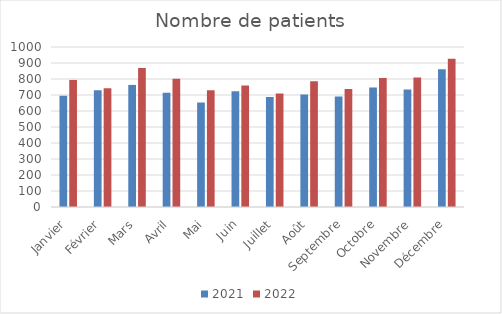
| Category | 2021 | 2022 |
|---|---|---|
| Janvier | 695 | 794 |
| Février | 730 | 742 |
| Mars | 763 | 869 |
| Avril | 714 | 802 |
| Mai | 653 | 730 |
| Juin | 724 | 760 |
| Juillet | 688 | 710 |
| Août | 703 | 786 |
| Septembre | 691 | 738 |
| Octobre | 747 | 807 |
| Novembre | 734 | 809 |
| Décembre | 861 | 927 |